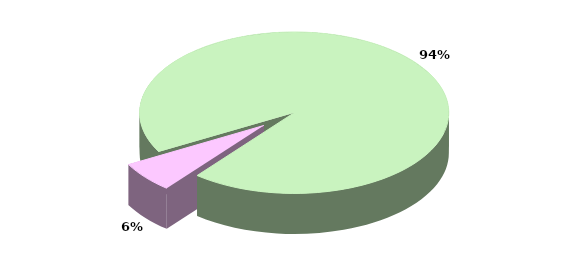
| Category | Series 0 |
|---|---|
| TOTALE ENTRATE CORRENTI | 23359.509 |
| TOTALE ENTRATE IN CONTO CAPITALE | 1527.763 |